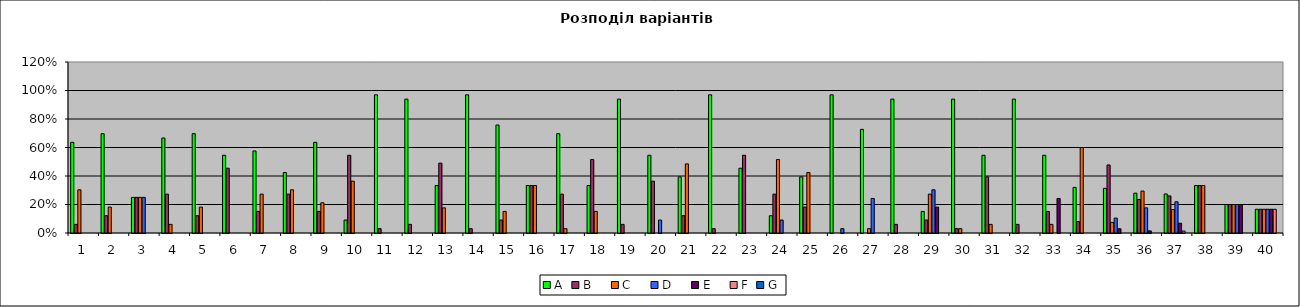
| Category | A | B    | C    | D    | E    | F | G |
|---|---|---|---|---|---|---|---|
| 0 | 0.636 | 0.061 | 0.303 | 0 | 0 | 0 | 0 |
| 1 | 0.697 | 0.121 | 0.182 | 0 | 0 | 0 | 0 |
| 2 | 0.25 | 0.25 | 0.25 | 0.25 | 0 | 0 | 0 |
| 3 | 0.667 | 0.273 | 0.061 | 0 | 0 | 0 | 0 |
| 4 | 0.697 | 0.121 | 0.182 | 0 | 0 | 0 | 0 |
| 5 | 0.545 | 0.455 | 0 | 0 | 0 | 0 | 0 |
| 6 | 0.576 | 0.152 | 0.273 | 0 | 0 | 0 | 0 |
| 7 | 0.424 | 0.273 | 0.303 | 0 | 0 | 0 | 0 |
| 8 | 0.636 | 0.152 | 0.212 | 0 | 0 | 0 | 0 |
| 9 | 0.091 | 0.545 | 0.364 | 0 | 0 | 0 | 0 |
| 10 | 0.97 | 0.03 | 0 | 0 | 0 | 0 | 0 |
| 11 | 0.939 | 0.061 | 0 | 0 | 0 | 0 | 0 |
| 12 | 0.333 | 0.49 | 0.176 | 0 | 0 | 0 | 0 |
| 13 | 0.97 | 0.03 | 0 | 0 | 0 | 0 | 0 |
| 14 | 0.758 | 0.091 | 0.152 | 0 | 0 | 0 | 0 |
| 15 | 0.333 | 0.333 | 0.333 | 0 | 0 | 0 | 0 |
| 16 | 0.697 | 0.273 | 0.03 | 0 | 0 | 0 | 0 |
| 17 | 0.333 | 0.515 | 0.152 | 0 | 0 | 0 | 0 |
| 18 | 0.939 | 0.061 | 0 | 0 | 0 | 0 | 0 |
| 19 | 0.545 | 0.364 | 0 | 0.091 | 0 | 0 | 0 |
| 20 | 0.394 | 0.121 | 0.485 | 0 | 0 | 0 | 0 |
| 21 | 0.97 | 0.03 | 0 | 0 | 0 | 0 | 0 |
| 22 | 0.455 | 0.545 | 0 | 0 | 0 | 0 | 0 |
| 23 | 0.121 | 0.273 | 0.515 | 0.091 | 0 | 0 | 0 |
| 24 | 0.394 | 0.182 | 0.424 | 0 | 0 | 0 | 0 |
| 25 | 0.97 | 0 | 0 | 0.03 | 0 | 0 | 0 |
| 26 | 0.727 | 0 | 0.03 | 0.242 | 0 | 0 | 0 |
| 27 | 0.939 | 0.061 | 0 | 0 | 0 | 0 | 0 |
| 28 | 0.152 | 0.091 | 0.273 | 0.303 | 0.182 | 0 | 0 |
| 29 | 0.939 | 0.03 | 0.03 | 0 | 0 | 0 | 0 |
| 30 | 0.545 | 0.394 | 0.061 | 0 | 0 | 0 | 0 |
| 31 | 0.939 | 0.061 | 0 | 0 | 0 | 0 | 0 |
| 32 | 0.545 | 0.152 | 0.061 | 0 | 0.242 | 0 | 0 |
| 33 | 0.32 | 0.08 | 0.6 | 0 | 0 | 0 | 0 |
| 34 | 0.313 | 0.478 | 0.075 | 0.104 | 0.03 | 0 | 0 |
| 35 | 0.279 | 0.235 | 0.294 | 0.176 | 0.015 | 0 | 0 |
| 36 | 0.274 | 0.26 | 0.164 | 0.219 | 0.068 | 0.014 | 0 |
| 37 | 0.333 | 0.333 | 0.333 | 0 | 0 | 0 | 0 |
| 38 | 0.2 | 0.2 | 0.2 | 0.2 | 0.2 | 0 | 0 |
| 39 | 0.167 | 0.167 | 0.167 | 0.167 | 0.167 | 0.167 | 0 |